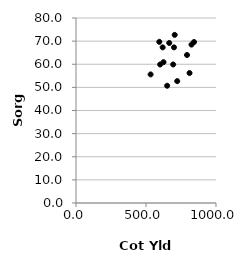
| Category | Series 0 |
|---|---|
| 601.0 | 59.9 |
| 705.0 | 72.7 |
| 533.0 | 55.6 |
| 700.0 | 67.3 |
| 666.0 | 69.2 |
| 619.0 | 67.3 |
| 595.0 | 69.7 |
| 625.0 | 60.9 |
| 694.0 | 59.9 |
| 651.0 | 50.7 |
| 723.0 | 52.7 |
| 843.0 | 69.6 |
| 825.0 | 68.5 |
| 811.0 | 56.2 |
| 793.0 | 64 |